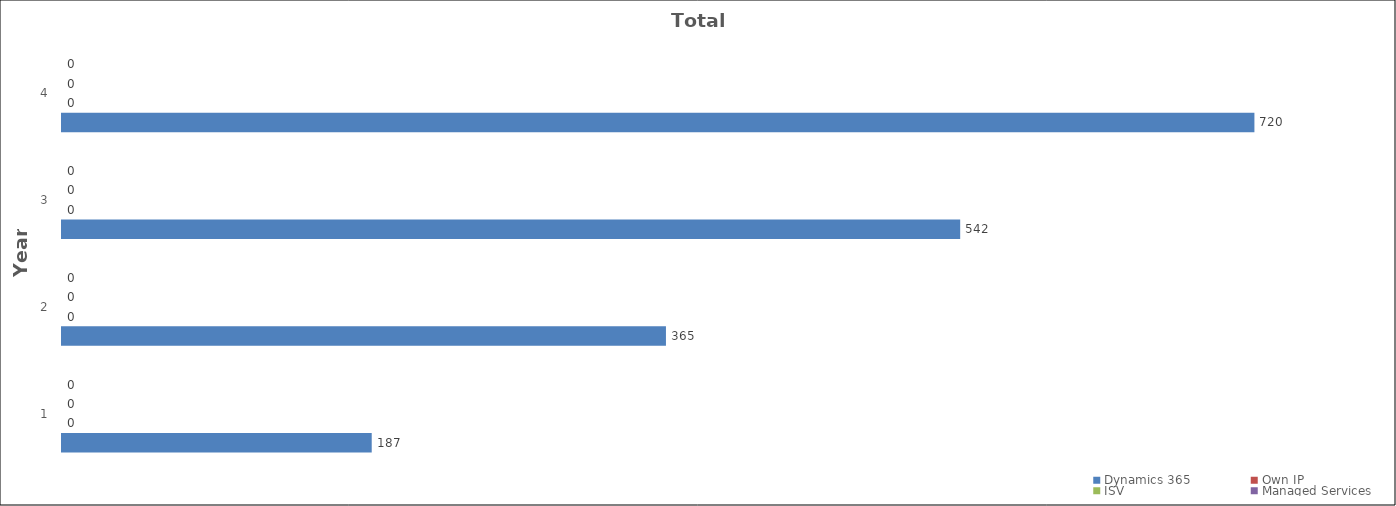
| Category | Dynamics 365 | Own IP | ISV | Managed Services |
|---|---|---|---|---|
| 1.0 | 187 | 0 | 0 | 0 |
| 2.0 | 364.65 | 0 | 0 | 0 |
| 3.0 | 542.3 | 0 | 0 | 0 |
| 4.0 | 719.95 | 0 | 0 | 0 |